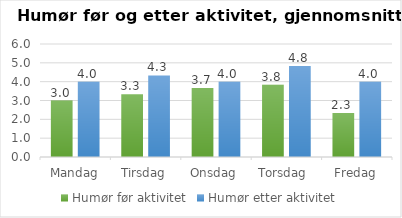
| Category | Humør før aktivitet | Humør etter aktivitet |
|---|---|---|
| Mandag | 3 | 4 |
| Tirsdag | 3.333 | 4.333 |
| Onsdag  | 3.667 | 4 |
| Torsdag  | 3.833 | 4.833 |
| Fredag | 2.333 | 4 |